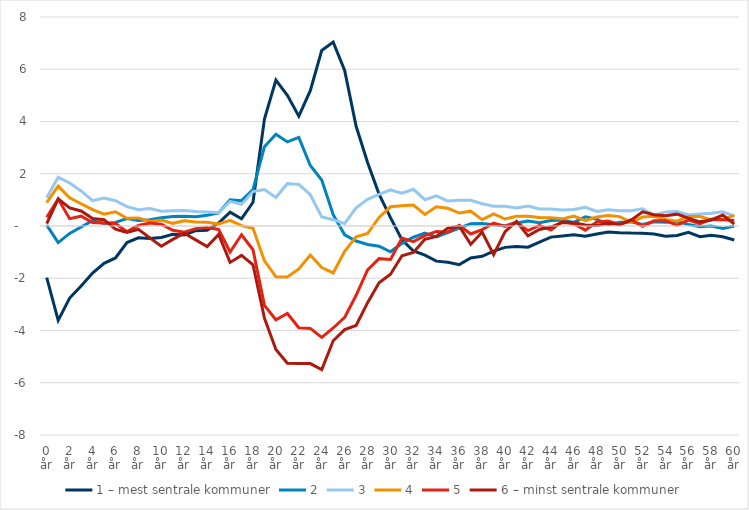
| Category | 1 – mest sentrale kommuner | 2 | 3 | 4 | 5 | 6 – minst sentrale kommuner |
|---|---|---|---|---|---|---|
| 0 år | -1.974 | 0.034 | 1.08 | 0.893 | 0.335 | 0.088 |
| 1 år | -3.614 | -0.636 | 1.869 | 1.525 | 1.03 | 1.042 |
| 2 år | -2.757 | -0.282 | 1.646 | 1.083 | 0.281 | 0.695 |
| 3 år | -2.298 | -0.037 | 1.342 | 0.851 | 0.376 | 0.575 |
| 4 år | -1.8 | 0.207 | 0.97 | 0.63 | 0.132 | 0.283 |
| 5 år | -1.426 | 0.098 | 1.07 | 0.451 | 0.118 | 0.242 |
| 6 år | -1.224 | 0.139 | 0.969 | 0.543 | 0.098 | -0.123 |
| 7 år | -0.632 | 0.285 | 0.739 | 0.296 | -0.216 | -0.248 |
| 8 år | -0.453 | 0.207 | 0.622 | 0.309 | 0.024 | -0.126 |
| 9 år | -0.477 | 0.241 | 0.672 | 0.17 | 0.114 | -0.456 |
| 10 år | -0.437 | 0.316 | 0.562 | 0.229 | 0.07 | -0.776 |
| 11 år | -0.314 | 0.363 | 0.582 | 0.102 | -0.162 | -0.512 |
| 12 år | -0.345 | 0.374 | 0.59 | 0.202 | -0.24 | -0.276 |
| 13 år | -0.179 | 0.352 | 0.552 | 0.158 | -0.101 | -0.532 |
| 14 år | -0.166 | 0.415 | 0.539 | 0.139 | -0.061 | -0.787 |
| 15 år | 0.113 | 0.499 | 0.504 | 0.08 | -0.13 | -0.322 |
| 16 år | 0.529 | 1.006 | 0.943 | 0.219 | -0.995 | -1.394 |
| 17 år | 0.276 | 0.97 | 0.827 | 0.014 | -0.335 | -1.126 |
| 18 år | 0.909 | 1.394 | 1.319 | -0.088 | -0.909 | -1.482 |
| 19 år | 4.093 | 3.034 | 1.392 | -1.336 | -3.037 | -3.527 |
| 20 år | 5.585 | 3.511 | 1.091 | -1.947 | -3.587 | -4.73 |
| 21 år | 5.003 | 3.22 | 1.625 | -1.947 | -3.347 | -5.25 |
| 22 år | 4.204 | 3.392 | 1.588 | -1.641 | -3.894 | -5.265 |
| 23 år | 5.179 | 2.317 | 1.198 | -1.111 | -3.919 | -5.267 |
| 24 år | 6.72 | 1.76 | 0.349 | -1.591 | -4.266 | -5.495 |
| 25 år | 7.039 | 0.433 | 0.242 | -1.797 | -3.903 | -4.392 |
| 26 år | 5.958 | -0.339 | 0.094 | -0.973 | -3.497 | -3.964 |
| 27 år | 3.816 | -0.576 | 0.696 | -0.409 | -2.651 | -3.81 |
| 28 år | 2.43 | -0.709 | 1.018 | -0.289 | -1.682 | -2.935 |
| 29 år | 1.221 | -0.771 | 1.207 | 0.329 | -1.249 | -2.171 |
| 30 år | 0.321 | -0.987 | 1.38 | 0.735 | -1.28 | -1.844 |
| 31 år | -0.528 | -0.665 | 1.253 | 0.776 | -0.461 | -1.137 |
| 32 år | -0.956 | -0.43 | 1.406 | 0.801 | -0.596 | -1.013 |
| 33 år | -1.115 | -0.269 | 1.007 | 0.443 | -0.371 | -0.509 |
| 34 år | -1.345 | -0.421 | 1.157 | 0.735 | -0.209 | -0.398 |
| 35 år | -1.384 | -0.252 | 0.955 | 0.677 | -0.242 | -0.084 |
| 36 år | -1.477 | -0.082 | 0.981 | 0.496 | 0.029 | -0.008 |
| 37 år | -1.221 | 0.088 | 0.986 | 0.567 | -0.306 | -0.705 |
| 38 år | -1.16 | 0.095 | 0.852 | 0.244 | -0.139 | -0.23 |
| 39 år | -0.961 | 0.05 | 0.759 | 0.464 | 0.111 | -1.099 |
| 40 år | -0.818 | 0.014 | 0.753 | 0.267 | -0.017 | -0.214 |
| 41 år | -0.785 | 0.117 | 0.686 | 0.375 | 0.156 | 0.174 |
| 42 år | -0.812 | 0.191 | 0.767 | 0.376 | -0.176 | -0.378 |
| 43 år | -0.616 | 0.121 | 0.655 | 0.328 | 0.025 | -0.131 |
| 44 år | -0.426 | 0.212 | 0.647 | 0.312 | -0.157 | -0.039 |
| 45 år | -0.383 | 0.232 | 0.611 | 0.273 | 0.166 | 0.139 |
| 46 år | -0.332 | 0.138 | 0.628 | 0.377 | 0.088 | 0.122 |
| 47 år | -0.395 | 0.351 | 0.712 | 0.206 | -0.16 | 0.042 |
| 48 år | -0.304 | 0.258 | 0.559 | 0.346 | 0.156 | 0.018 |
| 49 år | -0.232 | 0.053 | 0.625 | 0.401 | 0.192 | 0.106 |
| 50 år | -0.258 | 0.144 | 0.585 | 0.359 | 0.053 | 0.053 |
| 51 år | -0.272 | 0.157 | 0.582 | 0.147 | 0.238 | 0.22 |
| 52 år | -0.276 | 0.059 | 0.656 | 0.341 | -0.009 | 0.543 |
| 53 år | -0.31 | 0.161 | 0.41 | 0.369 | 0.199 | 0.432 |
| 54 år | -0.389 | 0.143 | 0.539 | 0.25 | 0.205 | 0.393 |
| 55 år | -0.363 | 0.167 | 0.553 | 0.184 | 0.033 | 0.454 |
| 56 år | -0.246 | 0.063 | 0.422 | 0.364 | 0.223 | 0.299 |
| 57 år | -0.41 | -0.03 | 0.462 | 0.36 | 0.088 | 0.159 |
| 58 år | -0.357 | 0.001 | 0.485 | 0.243 | 0.253 | 0.232 |
| 59 år | -0.41 | -0.094 | 0.546 | 0.251 | 0.238 | 0.42 |
| 60 år | -0.535 | -0.004 | 0.374 | 0.407 | 0.215 | 0.073 |